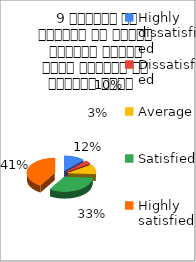
| Category |  9 शिक्षक ने शिक्षण के दौरान आधुनिक तकनीक पावर पॉइन्ट का प्रयोग किया   |
|---|---|
| Highly dissatisfied | 7 |
| Dissatisfied | 2 |
| Average | 6 |
| Satisfied | 19 |
| Highly satisfied | 24 |